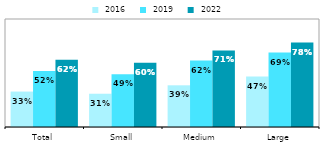
| Category |  2016 |  2019 |  2022 |
|---|---|---|---|
| Total | 0.328 | 0.519 | 0.623 |
| Small | 0.308 | 0.489 | 0.596 |
| Medium | 0.386 | 0.615 | 0.709 |
| Large | 0.467 | 0.689 | 0.782 |